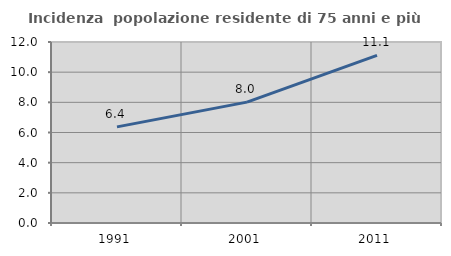
| Category | Incidenza  popolazione residente di 75 anni e più |
|---|---|
| 1991.0 | 6.374 |
| 2001.0 | 8.015 |
| 2011.0 | 11.115 |